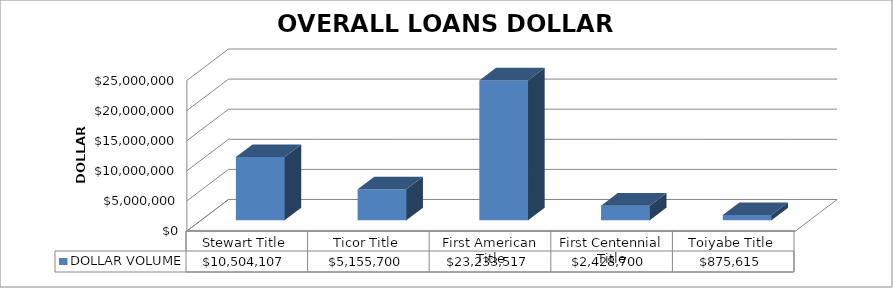
| Category | DOLLAR VOLUME |
|---|---|
| Stewart Title | 10504107 |
| Ticor Title | 5155700 |
| First American Title | 23233517 |
| First Centennial Title | 2428700 |
| Toiyabe Title | 875615 |